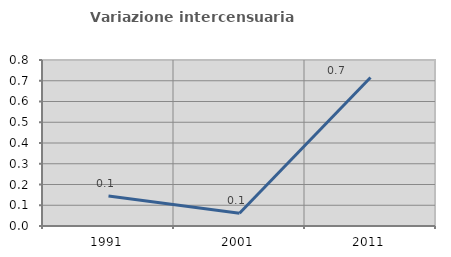
| Category | Variazione intercensuaria annua |
|---|---|
| 1991.0 | 0.144 |
| 2001.0 | 0.062 |
| 2011.0 | 0.716 |